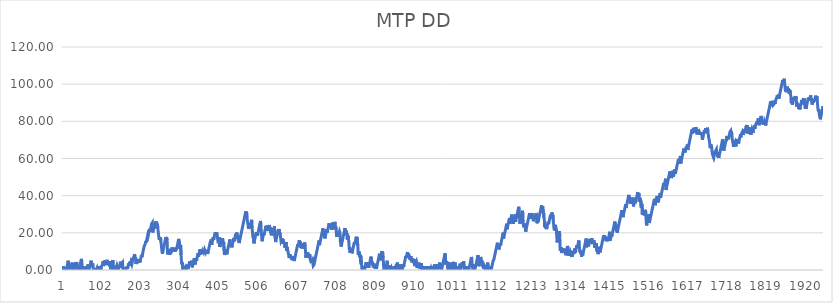
| Category | MTP DD |
|---|---|
| 0 | 1 |
| 1 | 2 |
| 2 | 0 |
| 3 | 1 |
| 4 | 0 |
| 5 | 1 |
| 6 | 0 |
| 7 | 1 |
| 8 | 0 |
| 9 | 1 |
| 10 | 2 |
| 11 | 3 |
| 12 | 4 |
| 13 | 5 |
| 14 | 2.6 |
| 15 | 0 |
| 16 | 1 |
| 17 | 2 |
| 18 | 0.37 |
| 19 | 0 |
| 20 | 1 |
| 21 | 2 |
| 22 | 3 |
| 23 | 4 |
| 24 | 1.06 |
| 25 | 2.06 |
| 26 | 3.06 |
| 27 | 0 |
| 28 | 0 |
| 29 | 1 |
| 30 | 2 |
| 31 | 3 |
| 32 | 4 |
| 33 | 2.33 |
| 34 | 3.33 |
| 35 | 4.33 |
| 36 | 1.44 |
| 37 | 0 |
| 38 | 0 |
| 39 | 1 |
| 40 | 2 |
| 41 | 0 |
| 42 | 1 |
| 43 | 2 |
| 44 | 3 |
| 45 | 4 |
| 46 | 5 |
| 47 | 6 |
| 48 | 4.33 |
| 49 | 1.68 |
| 50 | 0 |
| 51 | 0 |
| 52 | 0 |
| 53 | 1 |
| 54 | 2 |
| 55 | 0 |
| 56 | 0 |
| 57 | 0 |
| 58 | 0 |
| 59 | 1 |
| 60 | 0 |
| 61 | 0 |
| 62 | 1 |
| 63 | 2 |
| 64 | 3 |
| 65 | 0.06 |
| 66 | 0 |
| 67 | 0 |
| 68 | 1 |
| 69 | 2 |
| 70 | 3 |
| 71 | 4 |
| 72 | 5 |
| 73 | 3.04 |
| 74 | 1.57 |
| 75 | 2.57 |
| 76 | 3.57 |
| 77 | 1.67 |
| 78 | 0 |
| 79 | 1 |
| 80 | 0 |
| 81 | 1 |
| 82 | 0 |
| 83 | 0 |
| 84 | 0 |
| 85 | 0 |
| 86 | 0 |
| 87 | 1 |
| 88 | 0 |
| 89 | 1 |
| 90 | 2 |
| 91 | 0.31 |
| 92 | 0 |
| 93 | 0 |
| 94 | 1 |
| 95 | 0 |
| 96 | 1 |
| 97 | 0 |
| 98 | 1 |
| 99 | 2 |
| 100 | 1.7 |
| 101 | 2.7 |
| 102 | 3.7 |
| 103 | 4.7 |
| 104 | 2.15 |
| 105 | 3.15 |
| 106 | 4.15 |
| 107 | 5.15 |
| 108 | 2.65 |
| 109 | 3.65 |
| 110 | 4.65 |
| 111 | 3.49 |
| 112 | 4.49 |
| 113 | 5.49 |
| 114 | 3.86 |
| 115 | 3.56 |
| 116 | 2.59 |
| 117 | 3.59 |
| 118 | 2.79 |
| 119 | 3.79 |
| 120 | 4.79 |
| 121 | 1.65 |
| 122 | 2.65 |
| 123 | 0.35 |
| 124 | 1.35 |
| 125 | 2.35 |
| 126 | 3.35 |
| 127 | 4.35 |
| 128 | 5.35 |
| 129 | 3.39 |
| 130 | 0.16 |
| 131 | 0 |
| 132 | 0 |
| 133 | 1 |
| 134 | 0 |
| 135 | 0 |
| 136 | 1 |
| 137 | 2 |
| 138 | 1.35 |
| 139 | 2.35 |
| 140 | 1.74 |
| 141 | 0 |
| 142 | 0 |
| 143 | 1 |
| 144 | 0.5 |
| 145 | 1.5 |
| 146 | 2.5 |
| 147 | 3.5 |
| 148 | 4.5 |
| 149 | 1.36 |
| 150 | 2.36 |
| 151 | 3.36 |
| 152 | 3.01 |
| 153 | 4.01 |
| 154 | 0.48 |
| 155 | 0 |
| 156 | 1 |
| 157 | 0.53 |
| 158 | 1.53 |
| 159 | 0 |
| 160 | 1 |
| 161 | 0 |
| 162 | 0 |
| 163 | 0 |
| 164 | 1 |
| 165 | 2 |
| 166 | 0.65 |
| 167 | 1.65 |
| 168 | 2.65 |
| 169 | 3.65 |
| 170 | 2.49 |
| 171 | 3.49 |
| 172 | 4.49 |
| 173 | 2.24 |
| 174 | 3.24 |
| 175 | 4.24 |
| 176 | 3.88 |
| 177 | 3.04 |
| 178 | 4.04 |
| 179 | 5.04 |
| 180 | 6.04 |
| 181 | 5.52 |
| 182 | 6.52 |
| 183 | 7.52 |
| 184 | 8.52 |
| 185 | 7.6 |
| 186 | 5.64 |
| 187 | 6.64 |
| 188 | 3.21 |
| 189 | 4.21 |
| 190 | 5.21 |
| 191 | 4.71 |
| 192 | 3.73 |
| 193 | 4.73 |
| 194 | 5.73 |
| 195 | 4.67 |
| 196 | 5.67 |
| 197 | 5.19 |
| 198 | 4.11 |
| 199 | 5.11 |
| 200 | 6.11 |
| 201 | 7.11 |
| 202 | 8.11 |
| 203 | 6.95 |
| 204 | 7.95 |
| 205 | 8.95 |
| 206 | 9.95 |
| 207 | 10.95 |
| 208 | 11.95 |
| 209 | 12.95 |
| 210 | 12.57 |
| 211 | 13.57 |
| 212 | 14.57 |
| 213 | 15.57 |
| 214 | 14.78 |
| 215 | 15.78 |
| 216 | 16.78 |
| 217 | 17.78 |
| 218 | 18.78 |
| 219 | 18.15 |
| 220 | 19.15 |
| 221 | 20.15 |
| 222 | 21.15 |
| 223 | 22.15 |
| 224 | 20.8 |
| 225 | 21.8 |
| 226 | 22.8 |
| 227 | 23.8 |
| 228 | 24.8 |
| 229 | 24.46 |
| 230 | 25.46 |
| 231 | 20.17 |
| 232 | 21.17 |
| 233 | 22.17 |
| 234 | 23.17 |
| 235 | 22.21 |
| 236 | 23.21 |
| 237 | 24.21 |
| 238 | 25.21 |
| 239 | 26.21 |
| 240 | 24.7 |
| 241 | 25.7 |
| 242 | 23.88 |
| 243 | 24.88 |
| 244 | 22.48 |
| 245 | 20.74 |
| 246 | 20.44 |
| 247 | 17.21 |
| 248 | 16.3 |
| 249 | 17.3 |
| 250 | 16.55 |
| 251 | 17.55 |
| 252 | 15.25 |
| 253 | 13.78 |
| 254 | 11.48 |
| 255 | 9.87 |
| 256 | 8.79 |
| 257 | 9.79 |
| 258 | 10.79 |
| 259 | 11.79 |
| 260 | 12.79 |
| 261 | 13.79 |
| 262 | 14.79 |
| 263 | 15.79 |
| 264 | 16.79 |
| 265 | 17.79 |
| 266 | 16.44 |
| 267 | 17.44 |
| 268 | 16.01 |
| 269 | 9.35 |
| 270 | 8.38 |
| 271 | 9.38 |
| 272 | 10.38 |
| 273 | 11.38 |
| 274 | 9.85 |
| 275 | 8.22 |
| 276 | 9.22 |
| 277 | 10.22 |
| 278 | 9.18 |
| 279 | 10.18 |
| 280 | 11.18 |
| 281 | 12.18 |
| 282 | 10.57 |
| 283 | 11.57 |
| 284 | 10.64 |
| 285 | 11.64 |
| 286 | 9.95 |
| 287 | 10.95 |
| 288 | 11.95 |
| 289 | 9.99 |
| 290 | 10.99 |
| 291 | 11.99 |
| 292 | 10.74 |
| 293 | 11.74 |
| 294 | 12.74 |
| 295 | 13.74 |
| 296 | 14.74 |
| 297 | 15.74 |
| 298 | 16.74 |
| 299 | 14.54 |
| 300 | 15.54 |
| 301 | 11.42 |
| 302 | 12.42 |
| 303 | 13.42 |
| 304 | 8.13 |
| 305 | 4.9 |
| 306 | 3.14 |
| 307 | 4.14 |
| 308 | 1 |
| 309 | 0 |
| 310 | 1 |
| 311 | 2 |
| 312 | 0 |
| 313 | 0 |
| 314 | 1 |
| 315 | 0 |
| 316 | 0 |
| 317 | 0 |
| 318 | 0 |
| 319 | 1 |
| 320 | 2 |
| 321 | 3 |
| 322 | 0.6 |
| 323 | 1.6 |
| 324 | 2.6 |
| 325 | 3.6 |
| 326 | 4.6 |
| 327 | 2.68 |
| 328 | 2.01 |
| 329 | 3.01 |
| 330 | 4.01 |
| 331 | 5.01 |
| 332 | 3.91 |
| 333 | 1.41 |
| 334 | 2.41 |
| 335 | 3.41 |
| 336 | 4.41 |
| 337 | 5.41 |
| 338 | 6.41 |
| 339 | 5.66 |
| 340 | 2.97 |
| 341 | 3.97 |
| 342 | 4.97 |
| 343 | 5.97 |
| 344 | 5.06 |
| 345 | 6.06 |
| 346 | 7.06 |
| 347 | 8.06 |
| 348 | 9.06 |
| 349 | 7.12 |
| 350 | 8.12 |
| 351 | 9.12 |
| 352 | 10.12 |
| 353 | 11.12 |
| 354 | 8.38 |
| 355 | 9.38 |
| 356 | 8.57 |
| 357 | 9.57 |
| 358 | 10.57 |
| 359 | 9.34 |
| 360 | 10.34 |
| 361 | 10.14 |
| 362 | 9.54 |
| 363 | 10.54 |
| 364 | 9.88 |
| 365 | 10.88 |
| 366 | 10.68 |
| 367 | 9.84 |
| 368 | 10.84 |
| 369 | 8.73 |
| 370 | 9.73 |
| 371 | 8.63 |
| 372 | 9.63 |
| 373 | 8.83 |
| 374 | 9.83 |
| 375 | 10.83 |
| 376 | 11.83 |
| 377 | 12.83 |
| 378 | 13.83 |
| 379 | 14.83 |
| 380 | 14.59 |
| 381 | 15.59 |
| 382 | 16.59 |
| 383 | 13.65 |
| 384 | 14.65 |
| 385 | 15.65 |
| 386 | 16.65 |
| 387 | 17.65 |
| 388 | 16.2 |
| 389 | 17.2 |
| 390 | 18.2 |
| 391 | 19.2 |
| 392 | 20.2 |
| 393 | 19.45 |
| 394 | 18.16 |
| 395 | 19.16 |
| 396 | 20.16 |
| 397 | 18.93 |
| 398 | 16.68 |
| 399 | 17.68 |
| 400 | 14.45 |
| 401 | 15.45 |
| 402 | 16.45 |
| 403 | 17.45 |
| 404 | 12.35 |
| 405 | 13.35 |
| 406 | 14.35 |
| 407 | 15.35 |
| 408 | 16.35 |
| 409 | 15.19 |
| 410 | 16.19 |
| 411 | 17.19 |
| 412 | 16.8 |
| 413 | 13.91 |
| 414 | 14.91 |
| 415 | 10.6 |
| 416 | 8.1 |
| 417 | 9.1 |
| 418 | 10.1 |
| 419 | 9.33 |
| 420 | 10.33 |
| 421 | 11.33 |
| 422 | 8.44 |
| 423 | 9.44 |
| 424 | 10.44 |
| 425 | 11.44 |
| 426 | 12.44 |
| 427 | 13.44 |
| 428 | 14.44 |
| 429 | 15.44 |
| 430 | 16.44 |
| 431 | 13.01 |
| 432 | 14.01 |
| 433 | 12.52 |
| 434 | 13.52 |
| 435 | 12.21 |
| 436 | 13.21 |
| 437 | 14.21 |
| 438 | 15.21 |
| 439 | 16.21 |
| 440 | 17.21 |
| 441 | 15.49 |
| 442 | 16.49 |
| 443 | 17.49 |
| 444 | 18.49 |
| 445 | 19.49 |
| 446 | 18.18 |
| 447 | 19.18 |
| 448 | 20.18 |
| 449 | 16.85 |
| 450 | 17.85 |
| 451 | 18.85 |
| 452 | 15.62 |
| 453 | 16.62 |
| 454 | 14.51 |
| 455 | 15.51 |
| 456 | 16.51 |
| 457 | 17.51 |
| 458 | 18.51 |
| 459 | 19.51 |
| 460 | 20.51 |
| 461 | 21.51 |
| 462 | 22.51 |
| 463 | 23.51 |
| 464 | 24.51 |
| 465 | 25.51 |
| 466 | 26.51 |
| 467 | 27.51 |
| 468 | 28.51 |
| 469 | 29.51 |
| 470 | 30.51 |
| 471 | 31.51 |
| 472 | 30.33 |
| 473 | 31.33 |
| 474 | 28.19 |
| 475 | 27.68 |
| 476 | 25.38 |
| 477 | 23.89 |
| 478 | 22.11 |
| 479 | 23.11 |
| 480 | 24.11 |
| 481 | 25.11 |
| 482 | 23 |
| 483 | 24 |
| 484 | 25 |
| 485 | 26 |
| 486 | 27 |
| 487 | 22.59 |
| 488 | 21 |
| 489 | 18.8 |
| 490 | 17.17 |
| 491 | 18.17 |
| 492 | 14.35 |
| 493 | 15.35 |
| 494 | 16.35 |
| 495 | 17.35 |
| 496 | 18.35 |
| 497 | 19.35 |
| 498 | 20.35 |
| 499 | 19.37 |
| 500 | 20.37 |
| 501 | 18.41 |
| 502 | 19.41 |
| 503 | 20.41 |
| 504 | 21.41 |
| 505 | 22.41 |
| 506 | 23.41 |
| 507 | 24.41 |
| 508 | 25.41 |
| 509 | 26.41 |
| 510 | 23.72 |
| 511 | 20.58 |
| 512 | 17.98 |
| 513 | 15.48 |
| 514 | 16.48 |
| 515 | 17.48 |
| 516 | 18.48 |
| 517 | 19.48 |
| 518 | 18.79 |
| 519 | 19.79 |
| 520 | 20.79 |
| 521 | 21.79 |
| 522 | 22.79 |
| 523 | 23.79 |
| 524 | 22.28 |
| 525 | 20.97 |
| 526 | 21.97 |
| 527 | 22.97 |
| 528 | 23.97 |
| 529 | 21.23 |
| 530 | 22.23 |
| 531 | 23.23 |
| 532 | 24.23 |
| 533 | 22.12 |
| 534 | 23.12 |
| 535 | 20.08 |
| 536 | 21.08 |
| 537 | 18.68 |
| 538 | 19.68 |
| 539 | 20.68 |
| 540 | 21.68 |
| 541 | 22.68 |
| 542 | 20.48 |
| 543 | 21.48 |
| 544 | 22.48 |
| 545 | 23.48 |
| 546 | 18.19 |
| 547 | 16.96 |
| 548 | 15.04 |
| 549 | 16.04 |
| 550 | 17.04 |
| 551 | 18.04 |
| 552 | 19.04 |
| 553 | 20.04 |
| 554 | 21.04 |
| 555 | 22.04 |
| 556 | 21 |
| 557 | 22 |
| 558 | 19.11 |
| 559 | 20.11 |
| 560 | 18.62 |
| 561 | 17.09 |
| 562 | 15.25 |
| 563 | 14.98 |
| 564 | 15.98 |
| 565 | 16.98 |
| 566 | 15.51 |
| 567 | 16.51 |
| 568 | 14.11 |
| 569 | 15.11 |
| 570 | 13.91 |
| 571 | 14.91 |
| 572 | 12.07 |
| 573 | 13.07 |
| 574 | 14.07 |
| 575 | 15.07 |
| 576 | 10.37 |
| 577 | 11.37 |
| 578 | 12.37 |
| 579 | 10.98 |
| 580 | 9.63 |
| 581 | 8.76 |
| 582 | 7.45 |
| 583 | 6.43 |
| 584 | 7.43 |
| 585 | 8.43 |
| 586 | 7.45 |
| 587 | 6.39 |
| 588 | 7.39 |
| 589 | 5.84 |
| 590 | 6.84 |
| 591 | 5.27 |
| 592 | 6.27 |
| 593 | 5.56 |
| 594 | 6.56 |
| 595 | 7.56 |
| 596 | 4.82 |
| 597 | 5.82 |
| 598 | 6.82 |
| 599 | 7.82 |
| 600 | 8.82 |
| 601 | 9.82 |
| 602 | 10.82 |
| 603 | 11.82 |
| 604 | 12.82 |
| 605 | 13.82 |
| 606 | 12.95 |
| 607 | 13.95 |
| 608 | 14.95 |
| 609 | 15.95 |
| 610 | 14.6 |
| 611 | 15.6 |
| 612 | 12.17 |
| 613 | 13.17 |
| 614 | 14.17 |
| 615 | 13.03 |
| 616 | 11.52 |
| 617 | 12.52 |
| 618 | 12.32 |
| 619 | 13.32 |
| 620 | 14.32 |
| 621 | 12.83 |
| 622 | 13.83 |
| 623 | 14.83 |
| 624 | 12.58 |
| 625 | 10.08 |
| 626 | 6.65 |
| 627 | 7.65 |
| 628 | 8.65 |
| 629 | 9.65 |
| 630 | 8.4 |
| 631 | 9.4 |
| 632 | 7.29 |
| 633 | 8.29 |
| 634 | 6.57 |
| 635 | 7.57 |
| 636 | 8.57 |
| 637 | 6.12 |
| 638 | 4.77 |
| 639 | 5.77 |
| 640 | 3.71 |
| 641 | 4.71 |
| 642 | 4.46 |
| 643 | 5.46 |
| 644 | 3.66 |
| 645 | 2.27 |
| 646 | 1.84 |
| 647 | 2.84 |
| 648 | 3.84 |
| 649 | 4.84 |
| 650 | 5.84 |
| 651 | 6.84 |
| 652 | 7.84 |
| 653 | 8.84 |
| 654 | 9.84 |
| 655 | 10.84 |
| 656 | 11.84 |
| 657 | 12.84 |
| 658 | 13.84 |
| 659 | 14.84 |
| 660 | 15.84 |
| 661 | 13.39 |
| 662 | 14.39 |
| 663 | 15.39 |
| 664 | 16.39 |
| 665 | 17.39 |
| 666 | 18.39 |
| 667 | 19.39 |
| 668 | 20.39 |
| 669 | 21.39 |
| 670 | 22.39 |
| 671 | 21.16 |
| 672 | 20.23 |
| 673 | 19.21 |
| 674 | 18.01 |
| 675 | 16.99 |
| 676 | 17.99 |
| 677 | 18.99 |
| 678 | 19.99 |
| 679 | 20.99 |
| 680 | 21.99 |
| 681 | 20.19 |
| 682 | 21.19 |
| 683 | 22.19 |
| 684 | 23.19 |
| 685 | 24.19 |
| 686 | 25.19 |
| 687 | 22.59 |
| 688 | 23.59 |
| 689 | 24.59 |
| 690 | 23.51 |
| 691 | 24.51 |
| 692 | 21.72 |
| 693 | 22.72 |
| 694 | 23.72 |
| 695 | 24.72 |
| 696 | 25.72 |
| 697 | 21.9 |
| 698 | 22.9 |
| 699 | 23.9 |
| 700 | 24.9 |
| 701 | 25.9 |
| 702 | 22.18 |
| 703 | 23.18 |
| 704 | 22.26 |
| 705 | 18.73 |
| 706 | 17.81 |
| 707 | 18.81 |
| 708 | 18.65 |
| 709 | 19.65 |
| 710 | 20.65 |
| 711 | 18.73 |
| 712 | 19.73 |
| 713 | 20.73 |
| 714 | 20.14 |
| 715 | 15.44 |
| 716 | 14.05 |
| 717 | 12.62 |
| 718 | 13.62 |
| 719 | 14.62 |
| 720 | 15.62 |
| 721 | 16.62 |
| 722 | 17.62 |
| 723 | 18.62 |
| 724 | 19.62 |
| 725 | 20.62 |
| 726 | 21.62 |
| 727 | 22.62 |
| 728 | 19.19 |
| 729 | 20.19 |
| 730 | 21.19 |
| 731 | 18.89 |
| 732 | 19.89 |
| 733 | 16.46 |
| 734 | 17.46 |
| 735 | 18.46 |
| 736 | 16.75 |
| 737 | 14.5 |
| 738 | 11.27 |
| 739 | 12.27 |
| 740 | 9.33 |
| 741 | 10.33 |
| 742 | 11.33 |
| 743 | 10.41 |
| 744 | 11.41 |
| 745 | 9.01 |
| 746 | 10.01 |
| 747 | 11.01 |
| 748 | 12.01 |
| 749 | 13.01 |
| 750 | 14.01 |
| 751 | 15.01 |
| 752 | 13.89 |
| 753 | 14.89 |
| 754 | 15.89 |
| 755 | 16.89 |
| 756 | 17.89 |
| 757 | 16.73 |
| 758 | 17.73 |
| 759 | 17.62 |
| 760 | 12.92 |
| 761 | 8.02 |
| 762 | 9.02 |
| 763 | 10.02 |
| 764 | 9.55 |
| 765 | 7.25 |
| 766 | 8.25 |
| 767 | 5.11 |
| 768 | 4.7 |
| 769 | 5.7 |
| 770 | 1.98 |
| 771 | 0.14 |
| 772 | 1.14 |
| 773 | 2.14 |
| 774 | 0 |
| 775 | 1 |
| 776 | 2 |
| 777 | 0 |
| 778 | 1 |
| 779 | 2 |
| 780 | 3 |
| 781 | 4 |
| 782 | 3.21 |
| 783 | 4.21 |
| 784 | 1.27 |
| 785 | 2.27 |
| 786 | 1.4 |
| 787 | 2.4 |
| 788 | 1.2 |
| 789 | 2.2 |
| 790 | 3.2 |
| 791 | 4.2 |
| 792 | 5.2 |
| 793 | 6.2 |
| 794 | 7.2 |
| 795 | 5 |
| 796 | 3.45 |
| 797 | 4.45 |
| 798 | 2.59 |
| 799 | 3.59 |
| 800 | 1.43 |
| 801 | 2.43 |
| 802 | 3.43 |
| 803 | 1.08 |
| 804 | 2.08 |
| 805 | 0.63 |
| 806 | 1.63 |
| 807 | 2.63 |
| 808 | 0.73 |
| 809 | 1.73 |
| 810 | 2.73 |
| 811 | 3.73 |
| 812 | 4.73 |
| 813 | 5.73 |
| 814 | 6.73 |
| 815 | 7.73 |
| 816 | 8.73 |
| 817 | 5.2 |
| 818 | 6.2 |
| 819 | 7.2 |
| 820 | 8.2 |
| 821 | 9.2 |
| 822 | 10.2 |
| 823 | 8.51 |
| 824 | 9.51 |
| 825 | 6.47 |
| 826 | 4.31 |
| 827 | 0.39 |
| 828 | 0 |
| 829 | 1 |
| 830 | 2 |
| 831 | 0 |
| 832 | 1 |
| 833 | 2 |
| 834 | 3 |
| 835 | 4 |
| 836 | 5 |
| 837 | 1.77 |
| 838 | 0.16 |
| 839 | 1.16 |
| 840 | 2.16 |
| 841 | 0.45 |
| 842 | 1.45 |
| 843 | 2.45 |
| 844 | 0 |
| 845 | 0 |
| 846 | 1 |
| 847 | 0 |
| 848 | 1 |
| 849 | 0 |
| 850 | 1 |
| 851 | 0 |
| 852 | 1 |
| 853 | 2 |
| 854 | 0 |
| 855 | 0 |
| 856 | 1 |
| 857 | 0 |
| 858 | 0 |
| 859 | 1 |
| 860 | 2 |
| 861 | 3 |
| 862 | 4 |
| 863 | 3.63 |
| 864 | 0.3 |
| 865 | 1.3 |
| 866 | 2.3 |
| 867 | 0 |
| 868 | 1 |
| 869 | 2 |
| 870 | 3 |
| 871 | 1.45 |
| 872 | 0.43 |
| 873 | 1.43 |
| 874 | 0 |
| 875 | 1 |
| 876 | 2 |
| 877 | 3 |
| 878 | 1.59 |
| 879 | 2.59 |
| 880 | 3.59 |
| 881 | 4.59 |
| 882 | 5.59 |
| 883 | 6.59 |
| 884 | 7.59 |
| 885 | 6.69 |
| 886 | 7.69 |
| 887 | 8.69 |
| 888 | 9.69 |
| 889 | 6.85 |
| 890 | 7.85 |
| 891 | 8.85 |
| 892 | 7.42 |
| 893 | 6.15 |
| 894 | 7.15 |
| 895 | 5.54 |
| 896 | 6.54 |
| 897 | 7.54 |
| 898 | 4.89 |
| 899 | 5.89 |
| 900 | 4.17 |
| 901 | 5.17 |
| 902 | 6.17 |
| 903 | 3.92 |
| 904 | 4.92 |
| 905 | 5.92 |
| 906 | 3.03 |
| 907 | 2.07 |
| 908 | 3.07 |
| 909 | 4.07 |
| 910 | 3.86 |
| 911 | 4.86 |
| 912 | 3.84 |
| 913 | 1.05 |
| 914 | 2.05 |
| 915 | 3.05 |
| 916 | 1.99 |
| 917 | 2.99 |
| 918 | 3.99 |
| 919 | 2.03 |
| 920 | 3.03 |
| 921 | 0.63 |
| 922 | 1.63 |
| 923 | 2.63 |
| 924 | 3.63 |
| 925 | 1.43 |
| 926 | 0 |
| 927 | 1 |
| 928 | 2 |
| 929 | 0 |
| 930 | 1 |
| 931 | 0 |
| 932 | 1 |
| 933 | 0 |
| 934 | 1 |
| 935 | 2 |
| 936 | 0 |
| 937 | 1 |
| 938 | 2 |
| 939 | 0.8 |
| 940 | 0 |
| 941 | 0 |
| 942 | 1 |
| 943 | 2 |
| 944 | 0 |
| 945 | 1 |
| 946 | 0 |
| 947 | 0 |
| 948 | 1 |
| 949 | 0 |
| 950 | 1 |
| 951 | 2 |
| 952 | 0 |
| 953 | 1 |
| 954 | 0 |
| 955 | 0 |
| 956 | 1 |
| 957 | 2 |
| 958 | 3 |
| 959 | 0.99 |
| 960 | 1.99 |
| 961 | 0.03 |
| 962 | 1.03 |
| 963 | 2.03 |
| 964 | 3.03 |
| 965 | 0 |
| 966 | 0 |
| 967 | 0 |
| 968 | 1 |
| 969 | 2 |
| 970 | 3 |
| 971 | 4 |
| 972 | 2.29 |
| 973 | 3.29 |
| 974 | 0.79 |
| 975 | 0 |
| 976 | 0 |
| 977 | 1 |
| 978 | 2 |
| 979 | 3 |
| 980 | 4 |
| 981 | 5 |
| 982 | 6 |
| 983 | 7 |
| 984 | 8 |
| 985 | 9 |
| 986 | 7.14 |
| 987 | 2.83 |
| 988 | 3.83 |
| 989 | 4.83 |
| 990 | 3.32 |
| 991 | 4.32 |
| 992 | 1.09 |
| 993 | 0 |
| 994 | 1 |
| 995 | 2 |
| 996 | 3 |
| 997 | 4 |
| 998 | 1.55 |
| 999 | 2.55 |
| 1000 | 0 |
| 1001 | 1 |
| 1002 | 0.38 |
| 1003 | 1.38 |
| 1004 | 2.38 |
| 1005 | 3.38 |
| 1006 | 4.38 |
| 1007 | 0 |
| 1008 | 1 |
| 1009 | 2 |
| 1010 | 3 |
| 1011 | 4 |
| 1012 | 0.08 |
| 1013 | 1.08 |
| 1014 | 2.08 |
| 1015 | 0 |
| 1016 | 0 |
| 1017 | 0 |
| 1018 | 0 |
| 1019 | 1 |
| 1020 | 2 |
| 1021 | 0.37 |
| 1022 | 1.37 |
| 1023 | 2.37 |
| 1024 | 3.37 |
| 1025 | 0 |
| 1026 | 1 |
| 1027 | 2 |
| 1028 | 3 |
| 1029 | 4 |
| 1030 | 1.75 |
| 1031 | 2.75 |
| 1032 | 3.75 |
| 1033 | 4.75 |
| 1034 | 1.52 |
| 1035 | 0 |
| 1036 | 1 |
| 1037 | 2 |
| 1038 | 0 |
| 1039 | 1 |
| 1040 | 0 |
| 1041 | 1 |
| 1042 | 2 |
| 1043 | 0 |
| 1044 | 0 |
| 1045 | 0 |
| 1046 | 0 |
| 1047 | 1 |
| 1048 | 2 |
| 1049 | 3 |
| 1050 | 4 |
| 1051 | 5 |
| 1052 | 6 |
| 1053 | 7 |
| 1054 | 6.03 |
| 1055 | 2.31 |
| 1056 | 1.68 |
| 1057 | 0 |
| 1058 | 1 |
| 1059 | 2 |
| 1060 | 3 |
| 1061 | 0.45 |
| 1062 | 0 |
| 1063 | 1 |
| 1064 | 2 |
| 1065 | 3 |
| 1066 | 4 |
| 1067 | 5 |
| 1068 | 6 |
| 1069 | 7 |
| 1070 | 8 |
| 1071 | 6.24 |
| 1072 | 2.03 |
| 1073 | 3.03 |
| 1074 | 4.03 |
| 1075 | 5.03 |
| 1076 | 6.03 |
| 1077 | 7.03 |
| 1078 | 5.23 |
| 1079 | 4.07 |
| 1080 | 5.07 |
| 1081 | 2.03 |
| 1082 | 3.03 |
| 1083 | 4.03 |
| 1084 | 0.8 |
| 1085 | 1.8 |
| 1086 | 2.8 |
| 1087 | 0.5 |
| 1088 | 1.5 |
| 1089 | 2.5 |
| 1090 | 0 |
| 1091 | 0 |
| 1092 | 1 |
| 1093 | 2 |
| 1094 | 3 |
| 1095 | 4 |
| 1096 | 2.35 |
| 1097 | 0.1 |
| 1098 | 1.1 |
| 1099 | 2.1 |
| 1100 | 0 |
| 1101 | 0 |
| 1102 | 0 |
| 1103 | 0 |
| 1104 | 0 |
| 1105 | 1 |
| 1106 | 2 |
| 1107 | 3 |
| 1108 | 4 |
| 1109 | 5 |
| 1110 | 4.65 |
| 1111 | 5.65 |
| 1112 | 6.65 |
| 1113 | 7.65 |
| 1114 | 8.65 |
| 1115 | 9.65 |
| 1116 | 10.65 |
| 1117 | 11.65 |
| 1118 | 12.65 |
| 1119 | 13.65 |
| 1120 | 14.65 |
| 1121 | 11.81 |
| 1122 | 12.81 |
| 1123 | 13.81 |
| 1124 | 11.12 |
| 1125 | 12.12 |
| 1126 | 13.12 |
| 1127 | 14.12 |
| 1128 | 13.12 |
| 1129 | 14.12 |
| 1130 | 15.12 |
| 1131 | 16.12 |
| 1132 | 17.12 |
| 1133 | 18.12 |
| 1134 | 19.12 |
| 1135 | 20.12 |
| 1136 | 16.89 |
| 1137 | 17.89 |
| 1138 | 18.89 |
| 1139 | 19.89 |
| 1140 | 20.89 |
| 1141 | 21.89 |
| 1142 | 22.89 |
| 1143 | 23.89 |
| 1144 | 24.89 |
| 1145 | 21.95 |
| 1146 | 22.95 |
| 1147 | 23.95 |
| 1148 | 24.95 |
| 1149 | 25.95 |
| 1150 | 26.95 |
| 1151 | 27.95 |
| 1152 | 24.81 |
| 1153 | 25.81 |
| 1154 | 26.81 |
| 1155 | 27.81 |
| 1156 | 28.81 |
| 1157 | 29.81 |
| 1158 | 26.18 |
| 1159 | 27.18 |
| 1160 | 28.18 |
| 1161 | 24.95 |
| 1162 | 25.95 |
| 1163 | 26.95 |
| 1164 | 27.95 |
| 1165 | 28.95 |
| 1166 | 29.95 |
| 1167 | 26.03 |
| 1168 | 27.03 |
| 1169 | 28.03 |
| 1170 | 29.03 |
| 1171 | 30.03 |
| 1172 | 31.03 |
| 1173 | 32.03 |
| 1174 | 33.03 |
| 1175 | 34.03 |
| 1176 | 32.31 |
| 1177 | 29.42 |
| 1178 | 24.91 |
| 1179 | 25.91 |
| 1180 | 26.91 |
| 1181 | 27.91 |
| 1182 | 28.91 |
| 1183 | 29.91 |
| 1184 | 30.91 |
| 1185 | 31.91 |
| 1186 | 25.64 |
| 1187 | 25.27 |
| 1188 | 23.02 |
| 1189 | 24.02 |
| 1190 | 25.02 |
| 1191 | 23.79 |
| 1192 | 22.3 |
| 1193 | 20.61 |
| 1194 | 21.61 |
| 1195 | 22.61 |
| 1196 | 23.61 |
| 1197 | 24.61 |
| 1198 | 25.61 |
| 1199 | 26.61 |
| 1200 | 27.61 |
| 1201 | 28.61 |
| 1202 | 29.61 |
| 1203 | 30.61 |
| 1204 | 28.31 |
| 1205 | 29.31 |
| 1206 | 30.31 |
| 1207 | 27.66 |
| 1208 | 28.66 |
| 1209 | 29.66 |
| 1210 | 30.66 |
| 1211 | 27.62 |
| 1212 | 28.62 |
| 1213 | 26.27 |
| 1214 | 27.27 |
| 1215 | 28.27 |
| 1216 | 29.27 |
| 1217 | 27.66 |
| 1218 | 28.66 |
| 1219 | 29.66 |
| 1220 | 30.66 |
| 1221 | 29.33 |
| 1222 | 25.12 |
| 1223 | 26.12 |
| 1224 | 27.12 |
| 1225 | 25.81 |
| 1226 | 26.81 |
| 1227 | 27.81 |
| 1228 | 28.81 |
| 1229 | 29.81 |
| 1230 | 30.81 |
| 1231 | 31.81 |
| 1232 | 32.81 |
| 1233 | 33.81 |
| 1234 | 34.81 |
| 1235 | 32.26 |
| 1236 | 33.26 |
| 1237 | 34.26 |
| 1238 | 30.54 |
| 1239 | 31.54 |
| 1240 | 28.11 |
| 1241 | 27.43 |
| 1242 | 23.22 |
| 1243 | 24.22 |
| 1244 | 22.46 |
| 1245 | 23.46 |
| 1246 | 24.46 |
| 1247 | 22.01 |
| 1248 | 23.01 |
| 1249 | 24.01 |
| 1250 | 25.01 |
| 1251 | 26.01 |
| 1252 | 24.74 |
| 1253 | 25.74 |
| 1254 | 26.74 |
| 1255 | 27.74 |
| 1256 | 28.74 |
| 1257 | 29.74 |
| 1258 | 28.02 |
| 1259 | 29.02 |
| 1260 | 30.02 |
| 1261 | 31.02 |
| 1262 | 28.62 |
| 1263 | 29.62 |
| 1264 | 26.78 |
| 1265 | 24.77 |
| 1266 | 22.17 |
| 1267 | 21.34 |
| 1268 | 22.34 |
| 1269 | 23.34 |
| 1270 | 24.34 |
| 1271 | 21.2 |
| 1272 | 22.2 |
| 1273 | 18.97 |
| 1274 | 14.85 |
| 1275 | 15.85 |
| 1276 | 16.85 |
| 1277 | 17.85 |
| 1278 | 18.85 |
| 1279 | 19.85 |
| 1280 | 20.85 |
| 1281 | 18.2 |
| 1282 | 10.36 |
| 1283 | 11.36 |
| 1284 | 12.36 |
| 1285 | 10.35 |
| 1286 | 9.13 |
| 1287 | 10.13 |
| 1288 | 11.13 |
| 1289 | 9.56 |
| 1290 | 10.56 |
| 1291 | 11.56 |
| 1292 | 10.31 |
| 1293 | 11.31 |
| 1294 | 9.37 |
| 1295 | 10.37 |
| 1296 | 7.97 |
| 1297 | 8.97 |
| 1298 | 9.97 |
| 1299 | 10.97 |
| 1300 | 11.97 |
| 1301 | 12.97 |
| 1302 | 8.07 |
| 1303 | 9.07 |
| 1304 | 7.6 |
| 1305 | 8.6 |
| 1306 | 7.9 |
| 1307 | 8.9 |
| 1308 | 9.9 |
| 1309 | 9.31 |
| 1310 | 10.31 |
| 1311 | 7.42 |
| 1312 | 8.42 |
| 1313 | 7.26 |
| 1314 | 8.26 |
| 1315 | 9.26 |
| 1316 | 10.26 |
| 1317 | 8.65 |
| 1318 | 9.65 |
| 1319 | 10.65 |
| 1320 | 11.65 |
| 1321 | 9.25 |
| 1322 | 10.25 |
| 1323 | 11.25 |
| 1324 | 12.25 |
| 1325 | 13.25 |
| 1326 | 11.9 |
| 1327 | 12.9 |
| 1328 | 13.9 |
| 1329 | 14.9 |
| 1330 | 15.9 |
| 1331 | 13.55 |
| 1332 | 11.35 |
| 1333 | 9.51 |
| 1334 | 10.51 |
| 1335 | 9.02 |
| 1336 | 10.02 |
| 1337 | 7.13 |
| 1338 | 8.13 |
| 1339 | 9.13 |
| 1340 | 7.91 |
| 1341 | 8.91 |
| 1342 | 9.91 |
| 1343 | 10.91 |
| 1344 | 11.91 |
| 1345 | 12.91 |
| 1346 | 13.91 |
| 1347 | 14.91 |
| 1348 | 15.91 |
| 1349 | 16.91 |
| 1350 | 12.21 |
| 1351 | 13.21 |
| 1352 | 14.21 |
| 1353 | 15.21 |
| 1354 | 16.21 |
| 1355 | 12.78 |
| 1356 | 13.78 |
| 1357 | 14.78 |
| 1358 | 15.78 |
| 1359 | 16.78 |
| 1360 | 15.72 |
| 1361 | 14.01 |
| 1362 | 15.01 |
| 1363 | 16.01 |
| 1364 | 17.01 |
| 1365 | 14.56 |
| 1366 | 15.56 |
| 1367 | 13.99 |
| 1368 | 14.99 |
| 1369 | 15.99 |
| 1370 | 14.03 |
| 1371 | 11.97 |
| 1372 | 12.97 |
| 1373 | 12.54 |
| 1374 | 13.54 |
| 1375 | 14.54 |
| 1376 | 10.91 |
| 1377 | 9.91 |
| 1378 | 10.91 |
| 1379 | 10.39 |
| 1380 | 8.57 |
| 1381 | 9.57 |
| 1382 | 10.57 |
| 1383 | 11.57 |
| 1384 | 12.57 |
| 1385 | 9.53 |
| 1386 | 10.53 |
| 1387 | 11.53 |
| 1388 | 12.53 |
| 1389 | 13.53 |
| 1390 | 14.53 |
| 1391 | 15.53 |
| 1392 | 16.53 |
| 1393 | 17.53 |
| 1394 | 18.53 |
| 1395 | 17.78 |
| 1396 | 18.78 |
| 1397 | 17.04 |
| 1398 | 18.04 |
| 1399 | 16.1 |
| 1400 | 17.1 |
| 1401 | 15.49 |
| 1402 | 16.49 |
| 1403 | 17.49 |
| 1404 | 16.77 |
| 1405 | 15.55 |
| 1406 | 16.55 |
| 1407 | 17.55 |
| 1408 | 18.55 |
| 1409 | 19.55 |
| 1410 | 20.55 |
| 1411 | 15.85 |
| 1412 | 16.85 |
| 1413 | 17.85 |
| 1414 | 18.85 |
| 1415 | 18.06 |
| 1416 | 19.06 |
| 1417 | 20.06 |
| 1418 | 21.06 |
| 1419 | 22.06 |
| 1420 | 23.06 |
| 1421 | 24.06 |
| 1422 | 25.06 |
| 1423 | 26.06 |
| 1424 | 23.86 |
| 1425 | 24.86 |
| 1426 | 21.33 |
| 1427 | 22.33 |
| 1428 | 23.33 |
| 1429 | 20.1 |
| 1430 | 21.1 |
| 1431 | 22.1 |
| 1432 | 23.1 |
| 1433 | 24.1 |
| 1434 | 25.1 |
| 1435 | 26.1 |
| 1436 | 27.1 |
| 1437 | 28.1 |
| 1438 | 29.1 |
| 1439 | 30.1 |
| 1440 | 31.1 |
| 1441 | 32.1 |
| 1442 | 29.94 |
| 1443 | 30.94 |
| 1444 | 28.44 |
| 1445 | 29.44 |
| 1446 | 30.44 |
| 1447 | 31.44 |
| 1448 | 32.44 |
| 1449 | 33.44 |
| 1450 | 34.44 |
| 1451 | 35.44 |
| 1452 | 33.43 |
| 1453 | 34.43 |
| 1454 | 35.43 |
| 1455 | 36.43 |
| 1456 | 37.43 |
| 1457 | 38.43 |
| 1458 | 39.43 |
| 1459 | 40.43 |
| 1460 | 38.37 |
| 1461 | 39.37 |
| 1462 | 38.21 |
| 1463 | 35.66 |
| 1464 | 36.66 |
| 1465 | 37.66 |
| 1466 | 38.66 |
| 1467 | 36.06 |
| 1468 | 37.06 |
| 1469 | 38.06 |
| 1470 | 39.06 |
| 1471 | 34.26 |
| 1472 | 35.26 |
| 1473 | 36.26 |
| 1474 | 37.26 |
| 1475 | 38.26 |
| 1476 | 35.96 |
| 1477 | 36.96 |
| 1478 | 37.96 |
| 1479 | 38.96 |
| 1480 | 39.96 |
| 1481 | 40.96 |
| 1482 | 41.96 |
| 1483 | 39.27 |
| 1484 | 40.27 |
| 1485 | 41.27 |
| 1486 | 36.86 |
| 1487 | 37.86 |
| 1488 | 38.86 |
| 1489 | 36.41 |
| 1490 | 37.41 |
| 1491 | 33.59 |
| 1492 | 34.59 |
| 1493 | 35.59 |
| 1494 | 29.91 |
| 1495 | 30.91 |
| 1496 | 31.91 |
| 1497 | 30.93 |
| 1498 | 31.93 |
| 1499 | 29.38 |
| 1500 | 30.38 |
| 1501 | 31.38 |
| 1502 | 32.38 |
| 1503 | 30.03 |
| 1504 | 25.33 |
| 1505 | 24 |
| 1506 | 25 |
| 1507 | 26 |
| 1508 | 27 |
| 1509 | 28 |
| 1510 | 29 |
| 1511 | 30 |
| 1512 | 25.3 |
| 1513 | 26.3 |
| 1514 | 27.3 |
| 1515 | 28.3 |
| 1516 | 29.3 |
| 1517 | 30.3 |
| 1518 | 31.3 |
| 1519 | 32.3 |
| 1520 | 33.3 |
| 1521 | 34.3 |
| 1522 | 35.3 |
| 1523 | 36.3 |
| 1524 | 37.3 |
| 1525 | 38.3 |
| 1526 | 36.67 |
| 1527 | 34.87 |
| 1528 | 35.87 |
| 1529 | 36.87 |
| 1530 | 37.87 |
| 1531 | 38.87 |
| 1532 | 39.87 |
| 1533 | 36.64 |
| 1534 | 37.64 |
| 1535 | 36.44 |
| 1536 | 37.44 |
| 1537 | 38.44 |
| 1538 | 39.44 |
| 1539 | 40.44 |
| 1540 | 41.44 |
| 1541 | 38.84 |
| 1542 | 39.84 |
| 1543 | 40.84 |
| 1544 | 41.84 |
| 1545 | 42.84 |
| 1546 | 43.84 |
| 1547 | 44.84 |
| 1548 | 45.84 |
| 1549 | 46.84 |
| 1550 | 45.13 |
| 1551 | 46.13 |
| 1552 | 47.13 |
| 1553 | 48.13 |
| 1554 | 49.13 |
| 1555 | 43.05 |
| 1556 | 44.05 |
| 1557 | 45.05 |
| 1558 | 46.05 |
| 1559 | 47.05 |
| 1560 | 48.05 |
| 1561 | 49.05 |
| 1562 | 50.05 |
| 1563 | 51.05 |
| 1564 | 52.05 |
| 1565 | 53.05 |
| 1566 | 50.6 |
| 1567 | 51.6 |
| 1568 | 52.6 |
| 1569 | 49.46 |
| 1570 | 50.46 |
| 1571 | 51.46 |
| 1572 | 52.46 |
| 1573 | 53.46 |
| 1574 | 50.23 |
| 1575 | 51.23 |
| 1576 | 52.23 |
| 1577 | 53.23 |
| 1578 | 54.23 |
| 1579 | 51.73 |
| 1580 | 52.73 |
| 1581 | 53.73 |
| 1582 | 54.73 |
| 1583 | 55.73 |
| 1584 | 56.73 |
| 1585 | 57.73 |
| 1586 | 58.73 |
| 1587 | 59.73 |
| 1588 | 57.38 |
| 1589 | 58.38 |
| 1590 | 59.38 |
| 1591 | 60.38 |
| 1592 | 61.38 |
| 1593 | 57.36 |
| 1594 | 58.36 |
| 1595 | 59.36 |
| 1596 | 60.36 |
| 1597 | 61.36 |
| 1598 | 62.36 |
| 1599 | 63.36 |
| 1600 | 64.36 |
| 1601 | 65.36 |
| 1602 | 64.88 |
| 1603 | 65.88 |
| 1604 | 63.28 |
| 1605 | 64.28 |
| 1606 | 65.28 |
| 1607 | 66.28 |
| 1608 | 65.52 |
| 1609 | 66.52 |
| 1610 | 67.52 |
| 1611 | 64.58 |
| 1612 | 65.58 |
| 1613 | 66.58 |
| 1614 | 67.58 |
| 1615 | 68.58 |
| 1616 | 69.58 |
| 1617 | 70.58 |
| 1618 | 71.58 |
| 1619 | 72.58 |
| 1620 | 73.58 |
| 1621 | 74.58 |
| 1622 | 75.58 |
| 1623 | 73.52 |
| 1624 | 74.52 |
| 1625 | 75.52 |
| 1626 | 76.52 |
| 1627 | 75.84 |
| 1628 | 74.57 |
| 1629 | 73.87 |
| 1630 | 74.87 |
| 1631 | 75.87 |
| 1632 | 76.87 |
| 1633 | 76.04 |
| 1634 | 74.84 |
| 1635 | 72.9 |
| 1636 | 73.9 |
| 1637 | 74.9 |
| 1638 | 75.9 |
| 1639 | 73.94 |
| 1640 | 74.94 |
| 1641 | 72.98 |
| 1642 | 73.98 |
| 1643 | 72.8 |
| 1644 | 73.8 |
| 1645 | 73.09 |
| 1646 | 74.09 |
| 1647 | 73.01 |
| 1648 | 71.5 |
| 1649 | 70.09 |
| 1650 | 71.09 |
| 1651 | 72.09 |
| 1652 | 73.09 |
| 1653 | 74.09 |
| 1654 | 75.09 |
| 1655 | 74.32 |
| 1656 | 75.32 |
| 1657 | 76.32 |
| 1658 | 74.36 |
| 1659 | 73.59 |
| 1660 | 74.59 |
| 1661 | 75.59 |
| 1662 | 76.59 |
| 1663 | 74.14 |
| 1664 | 72.91 |
| 1665 | 71.4 |
| 1666 | 71.28 |
| 1667 | 69.32 |
| 1668 | 67.31 |
| 1669 | 65.53 |
| 1670 | 66.53 |
| 1671 | 67.53 |
| 1672 | 67.13 |
| 1673 | 65.66 |
| 1674 | 63.26 |
| 1675 | 63.23 |
| 1676 | 61.41 |
| 1677 | 61.28 |
| 1678 | 60.3 |
| 1679 | 61.3 |
| 1680 | 62.3 |
| 1681 | 63.3 |
| 1682 | 63.13 |
| 1683 | 64.13 |
| 1684 | 63.95 |
| 1685 | 64.95 |
| 1686 | 62.4 |
| 1687 | 63.4 |
| 1688 | 60.8 |
| 1689 | 61.8 |
| 1690 | 61.16 |
| 1691 | 60.34 |
| 1692 | 61.34 |
| 1693 | 62.34 |
| 1694 | 63.34 |
| 1695 | 64.34 |
| 1696 | 65.34 |
| 1697 | 66.34 |
| 1698 | 67.34 |
| 1699 | 68.34 |
| 1700 | 69.34 |
| 1701 | 70.34 |
| 1702 | 68.38 |
| 1703 | 66.37 |
| 1704 | 64.12 |
| 1705 | 65.12 |
| 1706 | 66.12 |
| 1707 | 67.12 |
| 1708 | 68.12 |
| 1709 | 69.12 |
| 1710 | 70.12 |
| 1711 | 71.12 |
| 1712 | 72.12 |
| 1713 | 70.53 |
| 1714 | 70.11 |
| 1715 | 71.11 |
| 1716 | 70.37 |
| 1717 | 71.37 |
| 1718 | 72.37 |
| 1719 | 73.37 |
| 1720 | 74.37 |
| 1721 | 73.98 |
| 1722 | 74.98 |
| 1723 | 73.59 |
| 1724 | 74.59 |
| 1725 | 71.55 |
| 1726 | 70.2 |
| 1727 | 69.73 |
| 1728 | 68.14 |
| 1729 | 66.3 |
| 1730 | 67.3 |
| 1731 | 66.81 |
| 1732 | 67.81 |
| 1733 | 68.81 |
| 1734 | 67.75 |
| 1735 | 66.53 |
| 1736 | 67.53 |
| 1737 | 68.53 |
| 1738 | 69.53 |
| 1739 | 70.53 |
| 1740 | 70.15 |
| 1741 | 68.95 |
| 1742 | 68.05 |
| 1743 | 69.05 |
| 1744 | 70.05 |
| 1745 | 71.05 |
| 1746 | 72.05 |
| 1747 | 73.05 |
| 1748 | 71.44 |
| 1749 | 72.44 |
| 1750 | 73.44 |
| 1751 | 73.34 |
| 1752 | 74.34 |
| 1753 | 73.81 |
| 1754 | 72.69 |
| 1755 | 73.69 |
| 1756 | 74.69 |
| 1757 | 75.69 |
| 1758 | 73.73 |
| 1759 | 74.73 |
| 1760 | 75.73 |
| 1761 | 76.73 |
| 1762 | 77.73 |
| 1763 | 77 |
| 1764 | 78 |
| 1765 | 76.14 |
| 1766 | 73.4 |
| 1767 | 74.4 |
| 1768 | 75.4 |
| 1769 | 76.4 |
| 1770 | 75.69 |
| 1771 | 76.69 |
| 1772 | 74.58 |
| 1773 | 74.25 |
| 1774 | 72.76 |
| 1775 | 73.76 |
| 1776 | 74.76 |
| 1777 | 75.76 |
| 1778 | 75.22 |
| 1779 | 73.77 |
| 1780 | 74.77 |
| 1781 | 75.77 |
| 1782 | 76.77 |
| 1783 | 77.77 |
| 1784 | 76.06 |
| 1785 | 77.06 |
| 1786 | 78.06 |
| 1787 | 77.84 |
| 1788 | 78.84 |
| 1789 | 79.84 |
| 1790 | 78.59 |
| 1791 | 79.59 |
| 1792 | 80.59 |
| 1793 | 81.59 |
| 1794 | 80.08 |
| 1795 | 77.88 |
| 1796 | 78.88 |
| 1797 | 79.88 |
| 1798 | 80.88 |
| 1799 | 81.88 |
| 1800 | 82.88 |
| 1801 | 82.19 |
| 1802 | 78.47 |
| 1803 | 79.47 |
| 1804 | 80.47 |
| 1805 | 79.71 |
| 1806 | 79.07 |
| 1807 | 78.22 |
| 1808 | 79.22 |
| 1809 | 80.22 |
| 1810 | 79.67 |
| 1811 | 78.9 |
| 1812 | 77.8 |
| 1813 | 78.8 |
| 1814 | 79.8 |
| 1815 | 80.8 |
| 1816 | 81.8 |
| 1817 | 82.8 |
| 1818 | 83.8 |
| 1819 | 84.8 |
| 1820 | 85.8 |
| 1821 | 86.8 |
| 1822 | 87.8 |
| 1823 | 88.8 |
| 1824 | 89.8 |
| 1825 | 90.8 |
| 1826 | 89.95 |
| 1827 | 89.5 |
| 1828 | 88.09 |
| 1829 | 89.09 |
| 1830 | 90.09 |
| 1831 | 91.09 |
| 1832 | 88.93 |
| 1833 | 88.48 |
| 1834 | 89.48 |
| 1835 | 90.48 |
| 1836 | 89.46 |
| 1837 | 90.46 |
| 1838 | 91.46 |
| 1839 | 90.94 |
| 1840 | 91.94 |
| 1841 | 92.94 |
| 1842 | 93.94 |
| 1843 | 92.39 |
| 1844 | 93.39 |
| 1845 | 94.39 |
| 1846 | 92.23 |
| 1847 | 93.23 |
| 1848 | 94.23 |
| 1849 | 95.23 |
| 1850 | 96.23 |
| 1851 | 97.23 |
| 1852 | 98.23 |
| 1853 | 99.23 |
| 1854 | 100.23 |
| 1855 | 101.23 |
| 1856 | 102.23 |
| 1857 | 99.93 |
| 1858 | 100.93 |
| 1859 | 101.93 |
| 1860 | 102.93 |
| 1861 | 100.53 |
| 1862 | 98.57 |
| 1863 | 96.32 |
| 1864 | 97.32 |
| 1865 | 95.69 |
| 1866 | 96.69 |
| 1867 | 97.69 |
| 1868 | 98.69 |
| 1869 | 96.81 |
| 1870 | 97.81 |
| 1871 | 96.4 |
| 1872 | 97.4 |
| 1873 | 94.71 |
| 1874 | 95.71 |
| 1875 | 96.71 |
| 1876 | 94.55 |
| 1877 | 93.59 |
| 1878 | 89.77 |
| 1879 | 90.77 |
| 1880 | 91.77 |
| 1881 | 88.98 |
| 1882 | 89.98 |
| 1883 | 90.98 |
| 1884 | 91.98 |
| 1885 | 92.98 |
| 1886 | 91.59 |
| 1887 | 92.59 |
| 1888 | 93.59 |
| 1889 | 92.34 |
| 1890 | 93.34 |
| 1891 | 91.91 |
| 1892 | 87.89 |
| 1893 | 88.89 |
| 1894 | 89.89 |
| 1895 | 88.4 |
| 1896 | 89.4 |
| 1897 | 86.8 |
| 1898 | 87.8 |
| 1899 | 88.8 |
| 1900 | 86.45 |
| 1901 | 87.45 |
| 1902 | 88.45 |
| 1903 | 89.45 |
| 1904 | 90.45 |
| 1905 | 91.45 |
| 1906 | 89.2 |
| 1907 | 90.2 |
| 1908 | 91.2 |
| 1909 | 92.2 |
| 1910 | 91.47 |
| 1911 | 92.47 |
| 1912 | 90.82 |
| 1913 | 88.57 |
| 1914 | 87.02 |
| 1915 | 88.02 |
| 1916 | 86.71 |
| 1917 | 87.71 |
| 1918 | 88.71 |
| 1919 | 89.71 |
| 1920 | 90.71 |
| 1921 | 91.71 |
| 1922 | 92.71 |
| 1923 | 91.69 |
| 1924 | 92.69 |
| 1925 | 90.98 |
| 1926 | 91.98 |
| 1927 | 92.98 |
| 1928 | 93.98 |
| 1929 | 91.43 |
| 1930 | 92.43 |
| 1931 | 90.32 |
| 1932 | 89.01 |
| 1933 | 90.01 |
| 1934 | 91.01 |
| 1935 | 90.01 |
| 1936 | 91.01 |
| 1937 | 92.01 |
| 1938 | 90.83 |
| 1939 | 91.83 |
| 1940 | 92.83 |
| 1941 | 93.83 |
| 1942 | 91.53 |
| 1943 | 92.53 |
| 1944 | 93.53 |
| 1945 | 91.88 |
| 1946 | 88.94 |
| 1947 | 86.29 |
| 1948 | 85.47 |
| 1949 | 86.47 |
| 1950 | 84.82 |
| 1951 | 82.62 |
| 1952 | 83.62 |
| 1953 | 81.12 |
| 1954 | 82.12 |
| 1955 | 83.12 |
| 1956 | 84.12 |
| 1957 | 85.12 |
| 1958 | 86.12 |
| 1959 | 87.12 |
| 1960 | 88.12 |
| 1961 | 85.43 |
| 1962 | 86.43 |